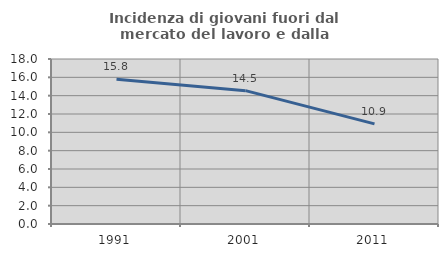
| Category | Incidenza di giovani fuori dal mercato del lavoro e dalla formazione  |
|---|---|
| 1991.0 | 15.792 |
| 2001.0 | 14.547 |
| 2011.0 | 10.922 |